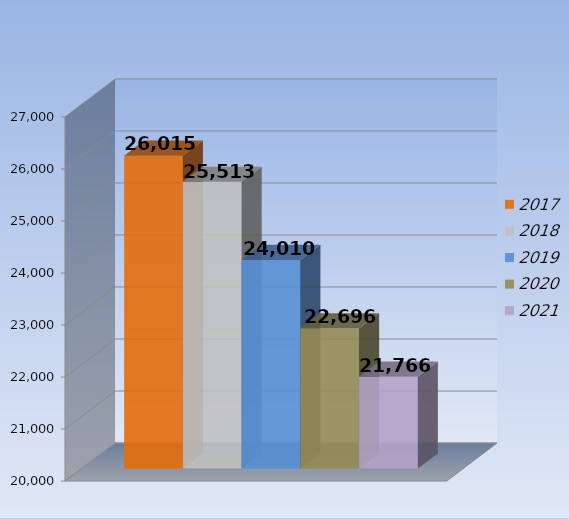
| Category | 2017 | 2018 | 2019 | 2020 | 2021 |
|---|---|---|---|---|---|
| 0 | 26015 | 25513 | 24010 | 22696 | 21766 |